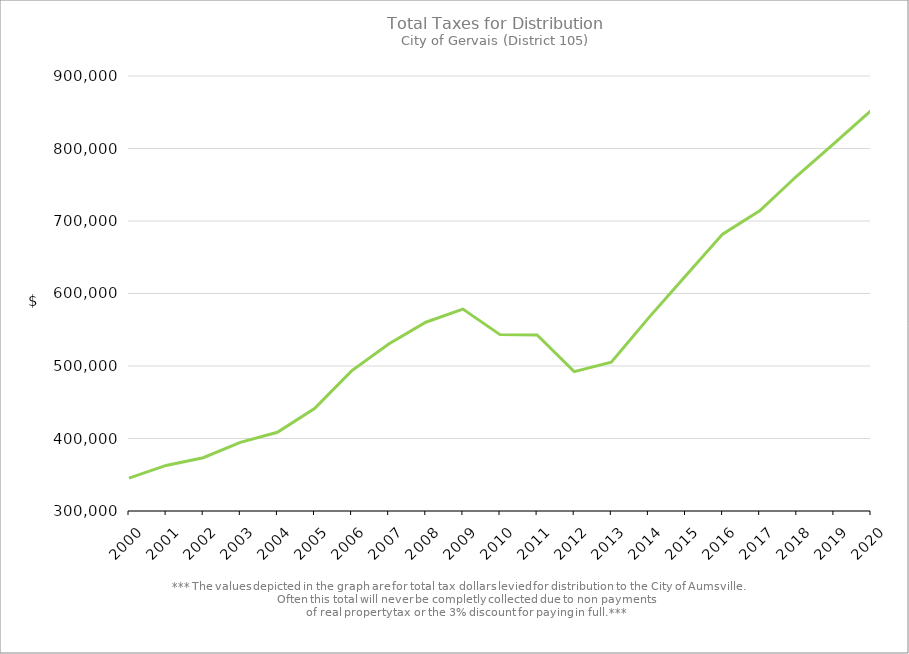
| Category | Series 0 |
|---|---|
| 2000.0 | 345233.96 |
| 2001.0 | 362873.54 |
| 2002.0 | 373459.12 |
| 2003.0 | 394610.65 |
| 2004.0 | 408541.73 |
| 2005.0 | 441331.57 |
| 2006.0 | 493321.62 |
| 2007.0 | 530423.05 |
| 2008.0 | 560384.63 |
| 2009.0 | 578486.62 |
| 2010.0 | 543293.02 |
| 2011.0 | 542722.04 |
| 2012.0 | 492299.85 |
| 2013.0 | 505207.2 |
| 2014.0 | 566063.35 |
| 2015.0 | 624111.04 |
| 2016.0 | 681918.38 |
| 2017.0 | 714026.89 |
| 2018.0 | 762050.71 |
| 2019.0 | 806734.53 |
| 2020.0 | 852324.5 |